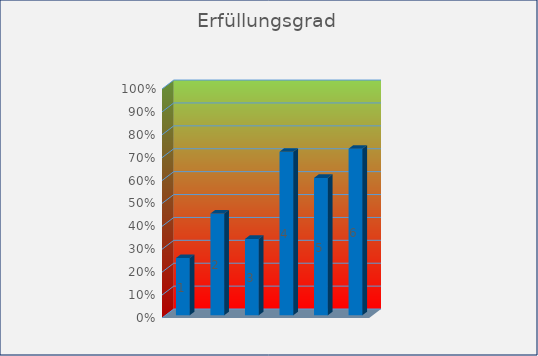
| Category | Erfüllungsgrad |
|---|---|
| Allgemeine Voraussetzungen | 0.25 |
| Verfahrensübersicht Datenschutz | 0.444 |
| Verarbeitung personenbezogener Daten | 0.333 |
| Datensicherheit | 0.714 |
| web-Sicherheit | 0.6 |
| Datenschutz-Organisation | 0.727 |